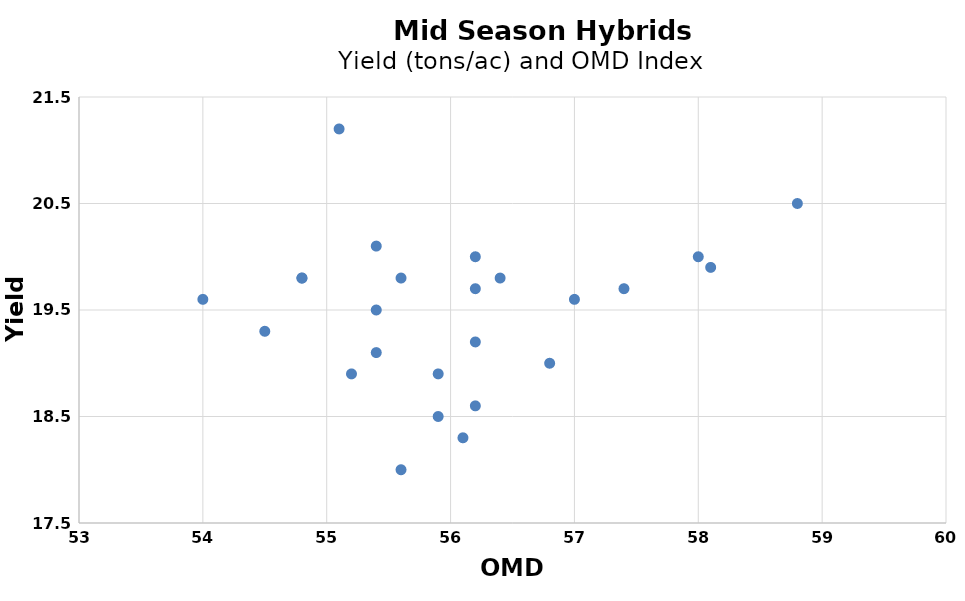
| Category | Series 0 |
|---|---|
| 55.4 | 19.1 |
| 55.6 | 18 |
| 54.8 | 19.8 |
| 56.8 | 19 |
| 56.2 | 19.2 |
| 55.2 | 18.9 |
| 55.9 | 18.9 |
| 55.4 | 20.1 |
| 57.0 | 19.6 |
| 58.8 | 20.5 |
| 55.1 | 21.2 |
| 54.5 | 19.3 |
| 58.0 | 20 |
| 54.0 | 19.6 |
| 57.4 | 19.7 |
| 55.6 | 19.8 |
| 56.2 | 18.6 |
| 55.9 | 18.5 |
| 56.4 | 19.8 |
| 54.8 | 19.8 |
| 55.4 | 19.5 |
| 56.2 | 19.7 |
| 58.1 | 19.9 |
| 56.2 | 20 |
| 56.1 | 18.3 |